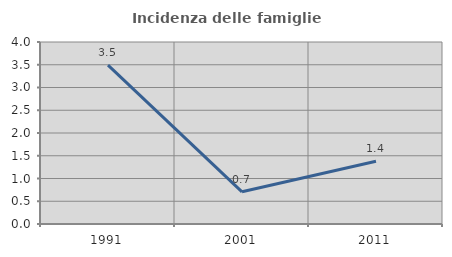
| Category | Incidenza delle famiglie numerose |
|---|---|
| 1991.0 | 3.493 |
| 2001.0 | 0.708 |
| 2011.0 | 1.379 |